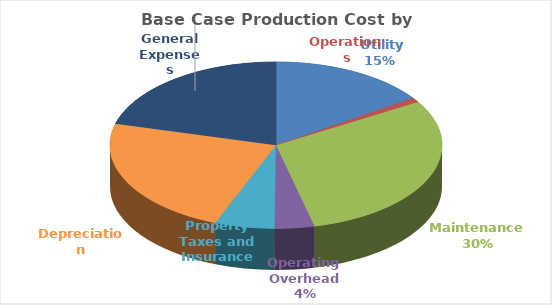
| Category | Series 0 |
|---|---|
|  Utility  | 6.218 |
| Operations | 0.365 |
| Maintenance  | 12.106 |
| Operating Overhead  | 1.558 |
| Property Taxes and Insurance | 2.339 |
| Depreciation | 9.357 |
| General Expenses | 8.431 |